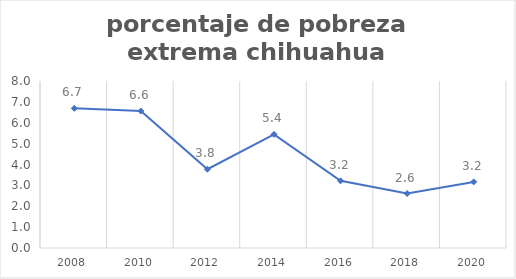
| Category | Series 0 |
|---|---|
| 2008.0 | 6.691 |
| 2010.0 | 6.561 |
| 2012.0 | 3.775 |
| 2014.0 | 5.443 |
| 2016.0 | 3.217 |
| 2018.0 | 2.609 |
| 2020.0 | 3.166 |